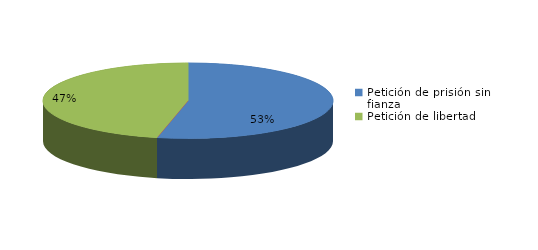
| Category | Series 0 |
|---|---|
| Petición de prisión sin fianza | 86 |
| Peticion de libertad con fianza | 0 |
| Petición de libertad | 75 |